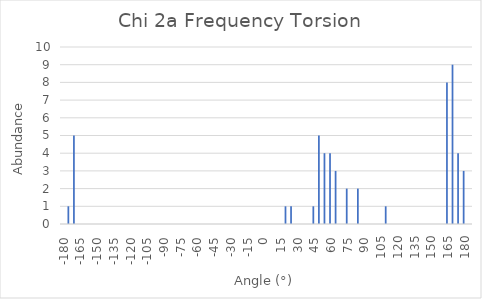
| Category | Series 0 |
|---|---|
| -180.0 | 0 |
| -175.0 | 1 |
| -170.0 | 5 |
| -165.0 | 0 |
| -160.0 | 0 |
| -155.0 | 0 |
| -150.0 | 0 |
| -145.0 | 0 |
| -140.0 | 0 |
| -135.0 | 0 |
| -130.0 | 0 |
| -125.0 | 0 |
| -120.0 | 0 |
| -115.0 | 0 |
| -110.0 | 0 |
| -105.0 | 0 |
| -100.0 | 0 |
| -95.0 | 0 |
| -90.0 | 0 |
| -85.0 | 0 |
| -80.0 | 0 |
| -75.0 | 0 |
| -70.0 | 0 |
| -65.0 | 0 |
| -60.0 | 0 |
| -55.0 | 0 |
| -50.0 | 0 |
| -45.0 | 0 |
| -40.0 | 0 |
| -35.0 | 0 |
| -30.0 | 0 |
| -25.0 | 0 |
| -20.0 | 0 |
| -15.0 | 0 |
| -10.0 | 0 |
| -5.0 | 0 |
| 0.0 | 0 |
| 5.0 | 0 |
| 10.0 | 0 |
| 15.0 | 0 |
| 20.0 | 1 |
| 25.0 | 1 |
| 30.0 | 0 |
| 35.0 | 0 |
| 40.0 | 0 |
| 45.0 | 1 |
| 50.0 | 5 |
| 55.0 | 4 |
| 60.0 | 4 |
| 65.0 | 3 |
| 70.0 | 0 |
| 75.0 | 2 |
| 80.0 | 0 |
| 85.0 | 2 |
| 90.0 | 0 |
| 95.0 | 0 |
| 100.0 | 0 |
| 105.0 | 0 |
| 110.0 | 1 |
| 115.0 | 0 |
| 120.0 | 0 |
| 125.0 | 0 |
| 130.0 | 0 |
| 135.0 | 0 |
| 140.0 | 0 |
| 145.0 | 0 |
| 150.0 | 0 |
| 155.0 | 0 |
| 160.0 | 0 |
| 165.0 | 8 |
| 170.0 | 9 |
| 175.0 | 4 |
| 180.0 | 3 |